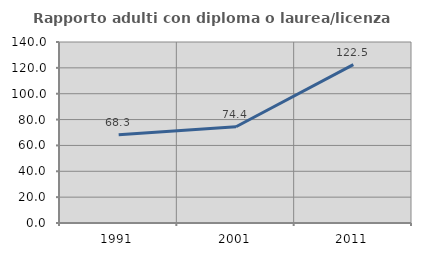
| Category | Rapporto adulti con diploma o laurea/licenza media  |
|---|---|
| 1991.0 | 68.293 |
| 2001.0 | 74.409 |
| 2011.0 | 122.53 |